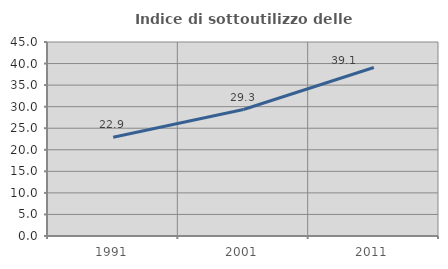
| Category | Indice di sottoutilizzo delle abitazioni  |
|---|---|
| 1991.0 | 22.925 |
| 2001.0 | 29.34 |
| 2011.0 | 39.089 |